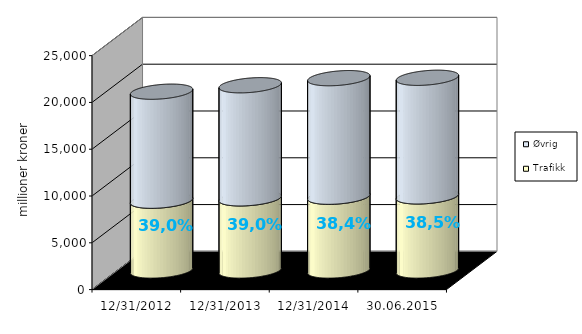
| Category | Trafikk | Øvrig |
|---|---|---|
| 31.12.2012 | 7457.552 | 11647.433 |
| 31.12.2013 | 7709.892 | 12083.527 |
| 31.12.2014 | 7884.668 | 12665.925 |
| 30.06.2015 | 7920.738 | 12670.201 |